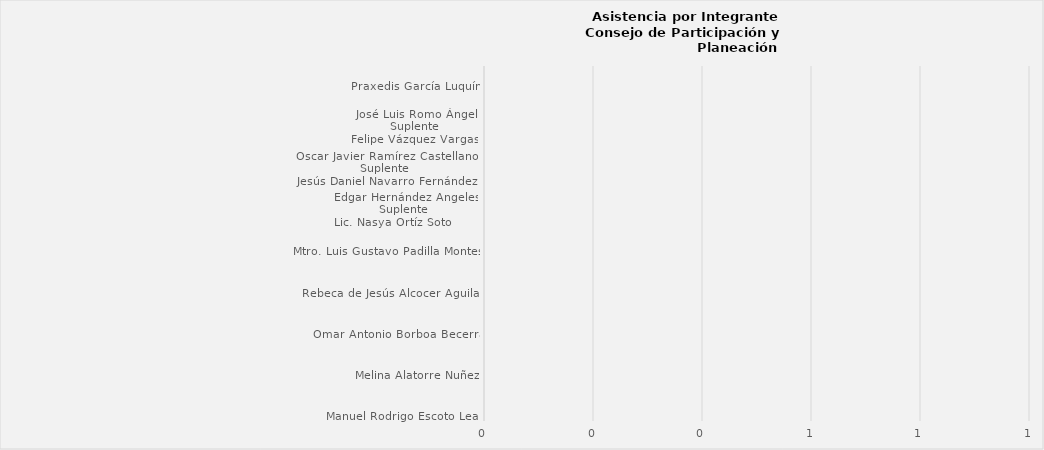
| Category | Manuel Rodrigo Escoto Leal |
|---|---|
| Manuel Rodrigo Escoto Leal | 0 |
| Paulina del Carmen Torres Padilla                                                                                    | 0 |
| Patricia Fregoso Cruz | 0 |
| Estefanía Juárez Limón | 0 |
| Ximena Buenfil Bermejo | 0 |
| Melina Alatorre Nuñez | 0 |
| Claudio Alberto de Angelis Martínez
Suplente
Kevin Arturo Peralta Rodríguez | 0 |
| Alberto Uribe Camacho
Suplente
David Sánchez Álvarez | 0 |
| Dulce Sarahí Cortés Vite
Suplente
Francisco Roberto Riverón Flores | 0 |
| Mariana Hernández González | 0 |
| Omar Antonio Borboa Becerra | 0 |
| Margarita Sierra Díaz de Rivera | 0 |
| Ing. Juan Manuel Chávez Ochoa
Suplente
Arq. Arturo Distancia Sánchez | 0 |
| Ing. Luis Enrique Barboza Niño | 0 |
| C.P. Raúl Flores López | 0 |
| Rebeca de Jesús Alcocer Aguilar | 0 |
| Salvador Mancera Sansoube | 0 |
| Estanislao Sánchez Sandoval | 0 |
| Arturo Valadez Ramírez | 0 |
| Patricia Rodríguez Guzmán | 0 |
| Mtro. Luis Gustavo Padilla Montes | 0 |
| Dr. Roberto Arias de la Mora                                                                                  | 0 |
| Saray Hernández Contreras | 0 |
| María Rosalba Rosas Cruz | 0 |
| Diego Hernández Angeles
Suplente
Mtra. María Rosas Palacios | 0 |
| Edgar Hernández Angeles
Suplente
Lic. Nasya Ortíz Soto         | 0 |
| Marissa Velázquez Ramírez | 0 |
| Alfonso Luna Flores | 0 |
| José Cruz Torres Sánchez | 0 |
| Martín Eduardo Santos Chávez | 0 |
| Oscar Javier Ramírez Castellanos
Suplente
Jesús Daniel Navarro Fernández  | 0 |
| Ismael Jáuregui Castañeda | 0 |
| Luis Enrique Ceseña Cayeros | 0 |
| Silvano Tello Corona
Suplente
María Concepción Doño Fermín | 0 |
| Ansurio Saldaña Castañeda  | 0 |
| José Luis Romo Ángel
Suplente
Felipe Vázquez Vargas  | 0 |
| Roberto Saúl Villegas Valdovinos  | 0 |
| José Luis García González  | 0 |
| Guadalupe Yolanda Padilla Jiménez | 0 |
| Minerva Ayala Ramírez | 0 |
| Praxedis García Luquín | 0 |
| Mario Fausto Flores Hernández | 0 |
| Blanca Estela Jiménez López | 0 |